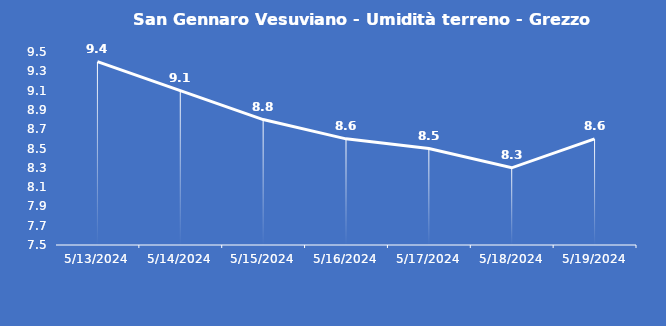
| Category | San Gennaro Vesuviano - Umidità terreno - Grezzo (%VWC) |
|---|---|
| 5/13/24 | 9.4 |
| 5/14/24 | 9.1 |
| 5/15/24 | 8.8 |
| 5/16/24 | 8.6 |
| 5/17/24 | 8.5 |
| 5/18/24 | 8.3 |
| 5/19/24 | 8.6 |